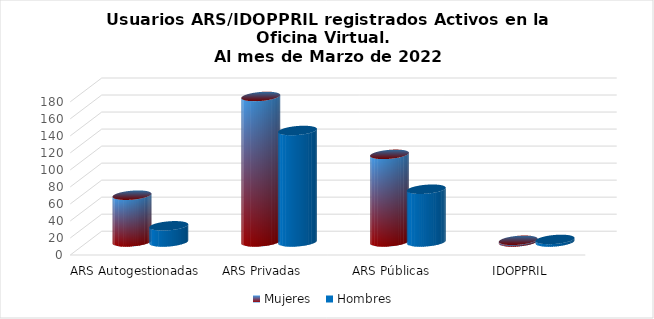
| Category | Mujeres | Hombres |
|---|---|---|
| ARS Autogestionadas | 55 | 19 |
| ARS Privadas | 171 | 131 |
| ARS Públicas | 103 | 62 |
| IDOPPRIL | 2 | 3 |